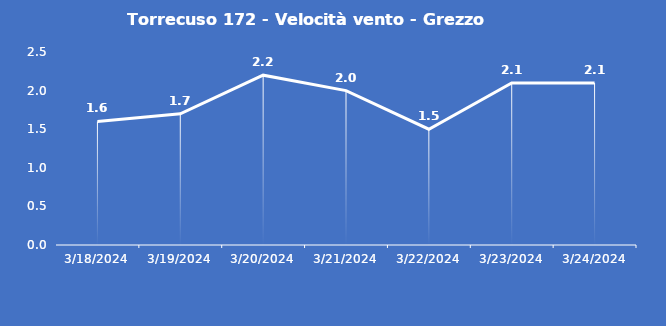
| Category | Torrecuso 172 - Velocità vento - Grezzo (m/s) |
|---|---|
| 3/18/24 | 1.6 |
| 3/19/24 | 1.7 |
| 3/20/24 | 2.2 |
| 3/21/24 | 2 |
| 3/22/24 | 1.5 |
| 3/23/24 | 2.1 |
| 3/24/24 | 2.1 |